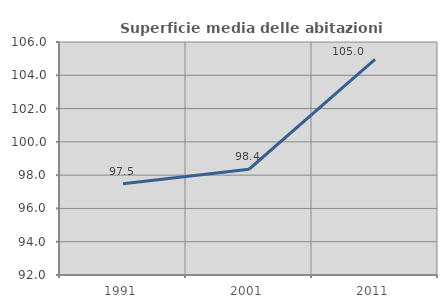
| Category | Superficie media delle abitazioni occupate |
|---|---|
| 1991.0 | 97.476 |
| 2001.0 | 98.354 |
| 2011.0 | 104.959 |